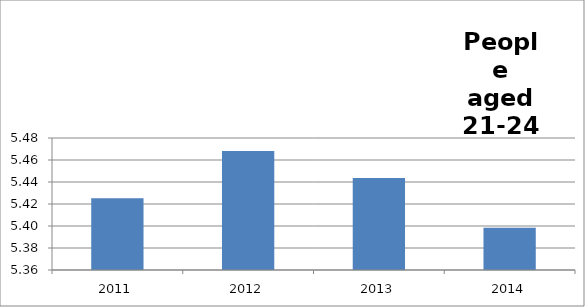
| Category | Series 0 |
|---|---|
| 2011 | 5.425 |
| 2012 | 5.468 |
| 2013 | 5.444 |
| 2014 | 5.398 |